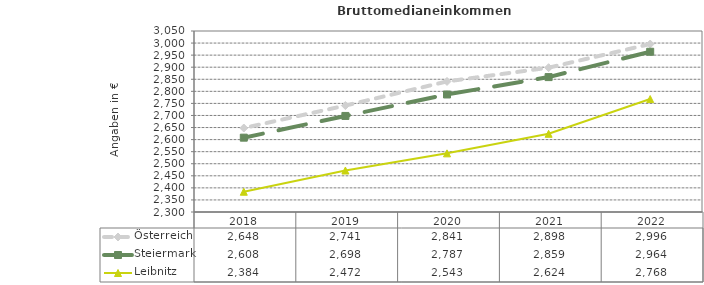
| Category | Österreich | Steiermark | Leibnitz |
|---|---|---|---|
| 2022.0 | 2996 | 2964 | 2768 |
| 2021.0 | 2898 | 2859 | 2624 |
| 2020.0 | 2841 | 2787 | 2543 |
| 2019.0 | 2741 | 2698 | 2472 |
| 2018.0 | 2648 | 2608 | 2384 |